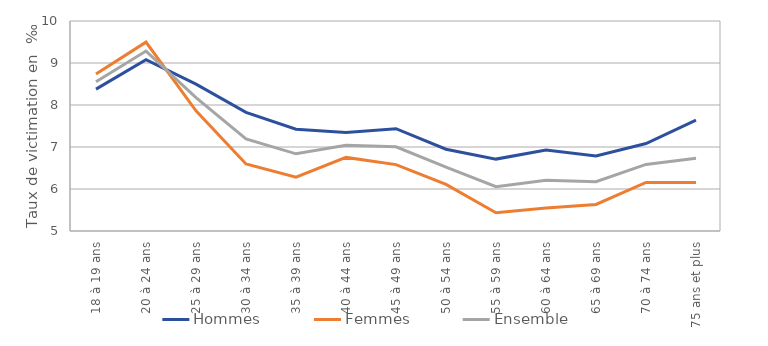
| Category | Hommes | Femmes | Ensemble |
|---|---|---|---|
| 18 à 19 ans | 8.378 | 8.736 | 8.552 |
| 20 à 24 ans | 9.081 | 9.497 | 9.285 |
| 25 à 29 ans | 8.498 | 7.861 | 8.177 |
| 30 à 34 ans | 7.826 | 6.596 | 7.195 |
| 35 à 39 ans | 7.424 | 6.283 | 6.837 |
| 40 à 44 ans | 7.345 | 6.752 | 7.043 |
| 45 à 49 ans | 7.437 | 6.581 | 7.004 |
| 50 à 54 ans | 6.947 | 6.11 | 6.522 |
| 55 à 59 ans | 6.712 | 5.434 | 6.056 |
| 60 à 64 ans | 6.928 | 5.547 | 6.206 |
| 65 à 69 ans | 6.786 | 5.632 | 6.173 |
| 70 à 74 ans | 7.082 | 6.157 | 6.585 |
| 75 ans et plus | 7.638 | 6.154 | 6.735 |